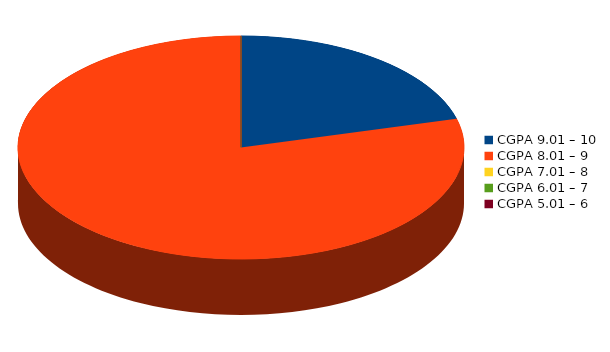
| Category | Number of students |
|---|---|
| CGPA 9.01 – 10 | 5 |
| CGPA 8.01 – 9 | 19 |
| CGPA 7.01 – 8 | 0 |
| CGPA 6.01 – 7 | 0 |
| CGPA 5.01 – 6 | 0 |